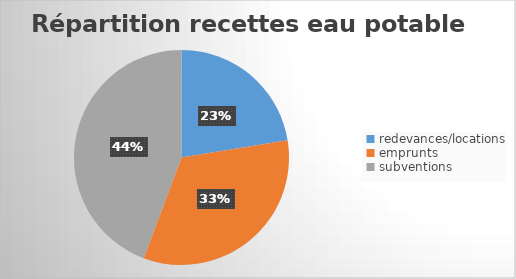
| Category | Series 0 |
|---|---|
| redevances/locations | 1186100 |
| emprunts | 1759150 |
| subventions | 2341050 |